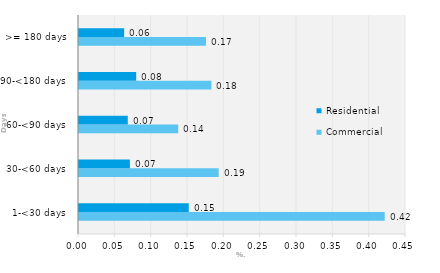
| Category | Commercial | Residential |
|---|---|---|
| 1-<30 days | 0.421 | 0.151 |
| 30-<60 days | 0.192 | 0.07 |
| 60-<90 days | 0.137 | 0.067 |
| 90-<180 days | 0.182 | 0.079 |
| >= 180 days | 0.175 | 0.062 |